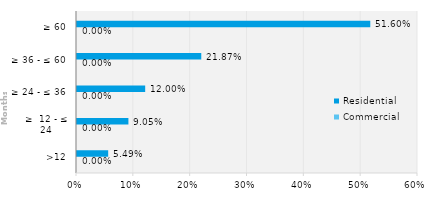
| Category | Commercial | Residential |
|---|---|---|
| >12 | 0 | 0.055 |
| ≥  12 - ≤ 24 | 0 | 0.09 |
| ≥ 24 - ≤ 36 | 0 | 0.12 |
| ≥ 36 - ≤ 60 | 0 | 0.219 |
| ≥ 60 | 0 | 0.516 |